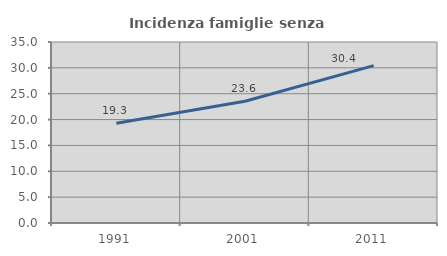
| Category | Incidenza famiglie senza nuclei |
|---|---|
| 1991.0 | 19.275 |
| 2001.0 | 23.554 |
| 2011.0 | 30.426 |